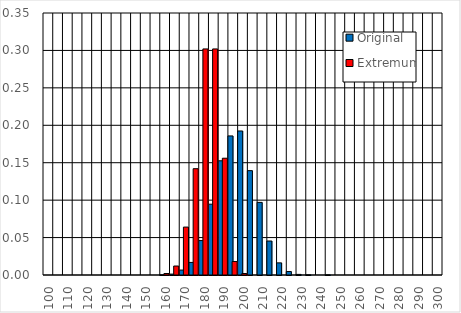
| Category | Original | Extremum |
|---|---|---|
| 100.0 | 0 | 0 |
| 105.0 | 0 | 0 |
| 110.0 | 0 | 0 |
| 115.0 | 0 | 0 |
| 120.0 | 0 | 0 |
| 125.0 | 0 | 0 |
| 130.0 | 0 | 0 |
| 135.0 | 0 | 0 |
| 140.0 | 0 | 0 |
| 145.0 | 0 | 0 |
| 150.0 | 0 | 0 |
| 155.0 | 0 | 0 |
| 160.0 | 0 | 0.002 |
| 165.0 | 0.001 | 0.012 |
| 170.0 | 0.007 | 0.064 |
| 175.0 | 0.017 | 0.142 |
| 180.0 | 0.046 | 0.302 |
| 185.0 | 0.095 | 0.302 |
| 190.0 | 0.153 | 0.156 |
| 195.0 | 0.186 | 0.018 |
| 200.0 | 0.192 | 0.002 |
| 205.0 | 0.139 | 0 |
| 210.0 | 0.097 | 0 |
| 215.0 | 0.045 | 0 |
| 220.0 | 0.016 | 0 |
| 225.0 | 0.005 | 0 |
| 230.0 | 0.001 | 0 |
| 235.0 | 0 | 0 |
| 240.0 | 0 | 0 |
| 245.0 | 0 | 0 |
| 250.0 | 0 | 0 |
| 255.0 | 0 | 0 |
| 260.0 | 0 | 0 |
| 265.0 | 0 | 0 |
| 270.0 | 0 | 0 |
| 275.0 | 0 | 0 |
| 280.0 | 0 | 0 |
| 285.0 | 0 | 0 |
| 290.0 | 0 | 0 |
| 295.0 | 0 | 0 |
| 300.0 | 0 | 0 |